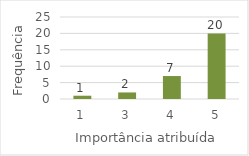
| Category | Series 0 |
|---|---|
| 1.0 | 1 |
| 3.0 | 2 |
| 4.0 | 7 |
| 5.0 | 20 |